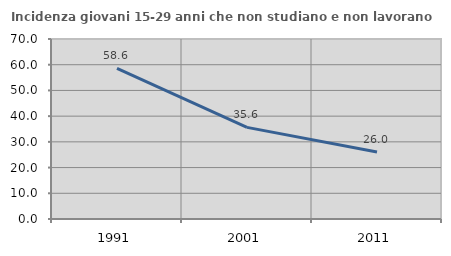
| Category | Incidenza giovani 15-29 anni che non studiano e non lavorano  |
|---|---|
| 1991.0 | 58.571 |
| 2001.0 | 35.632 |
| 2011.0 | 26.039 |